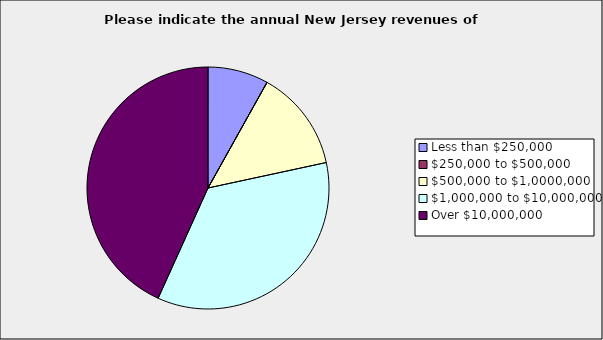
| Category | Series 0 |
|---|---|
| Less than $250,000 | 0.081 |
| $250,000 to $500,000 | 0 |
| $500,000 to $1,0000,000 | 0.135 |
| $1,000,000 to $10,000,000 | 0.351 |
| Over $10,000,000 | 0.432 |